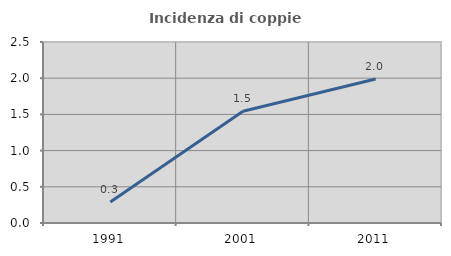
| Category | Incidenza di coppie miste |
|---|---|
| 1991.0 | 0.29 |
| 2001.0 | 1.545 |
| 2011.0 | 1.99 |